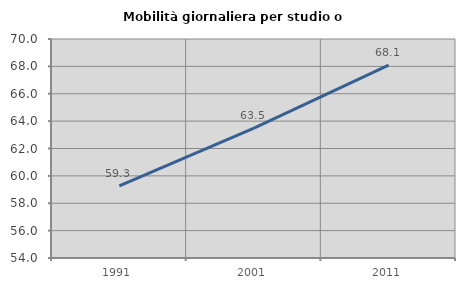
| Category | Mobilità giornaliera per studio o lavoro |
|---|---|
| 1991.0 | 59.275 |
| 2001.0 | 63.485 |
| 2011.0 | 68.085 |